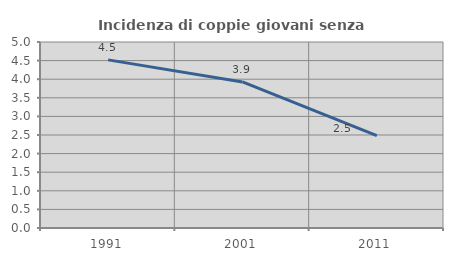
| Category | Incidenza di coppie giovani senza figli |
|---|---|
| 1991.0 | 4.52 |
| 2001.0 | 3.926 |
| 2011.0 | 2.483 |